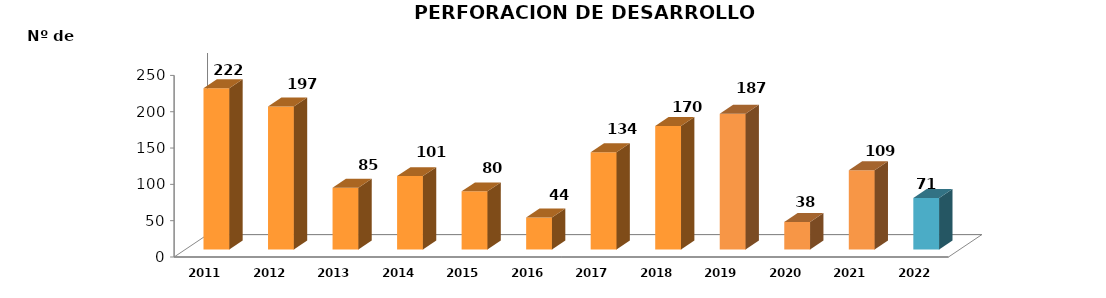
| Category | Series 0 |
|---|---|
| 2011.0 | 222 |
| 2012.0 | 197 |
| 2013.0 | 85 |
| 2014.0 | 101 |
| 2015.0 | 80 |
| 2016.0 | 44 |
| 2017.0 | 134 |
| 2018.0 | 170 |
| 2019.0 | 187 |
| 2020.0 | 38 |
| 2021.0 | 109 |
| 2022.0 | 71 |